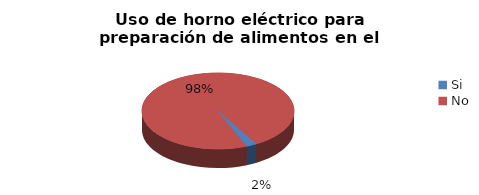
| Category | Series 0 |
|---|---|
| Si | 0.021 |
| No | 0.979 |